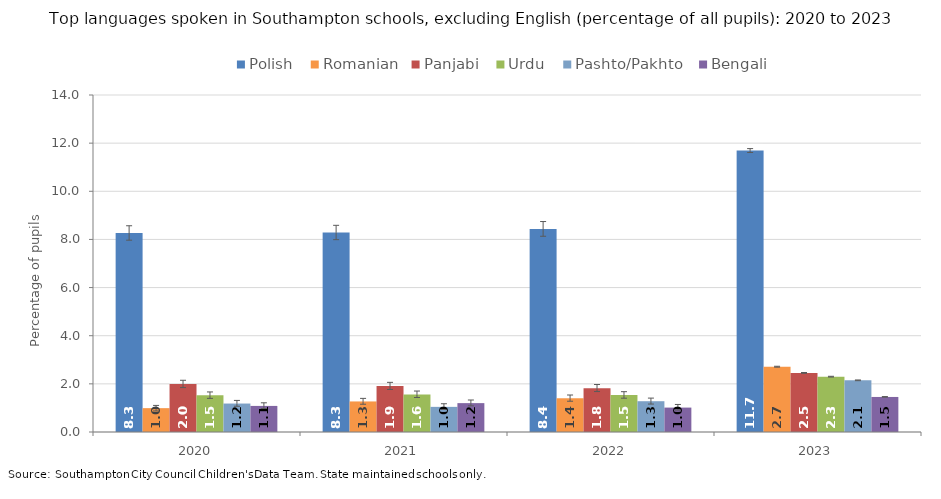
| Category | Polish  | Romanian | Panjabi  | Urdu  | Pashto/Pakhto  | Bengali  |
|---|---|---|---|---|---|---|
| 2020.0 | 8.263 | 0.991 | 1.991 | 1.525 | 1.182 | 1.083 |
| 2021.0 | 8.283 | 1.269 | 1.909 | 1.562 | 1.044 | 1.199 |
| 2022.0 | 8.433 | 1.402 | 1.821 | 1.534 | 1.279 | 1.014 |
| 2023.0 | 11.69 | 2.711 | 2.453 | 2.297 | 2.146 | 1.456 |